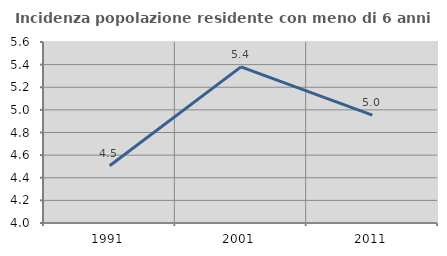
| Category | Incidenza popolazione residente con meno di 6 anni |
|---|---|
| 1991.0 | 4.506 |
| 2001.0 | 5.38 |
| 2011.0 | 4.954 |